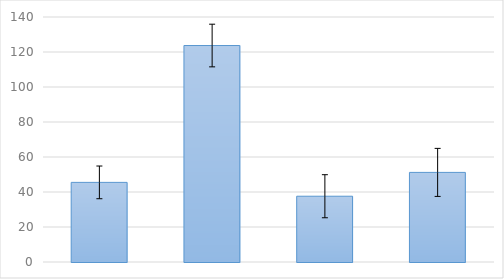
| Category | Series 0 |
|---|---|
| 0 | 45.5 |
| 1 | 123.7 |
| 2 | 37.583 |
| 3 | 51.2 |